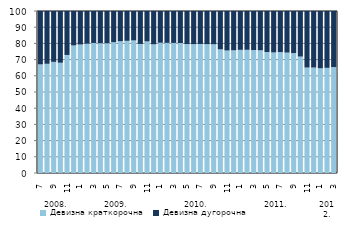
| Category | Девизна краткорочна | Девизна дугорочна |
|---|---|---|
| 0 | 67.053 | 32.947 |
| 1900-01-01 | 67.417 | 32.583 |
| 1900-01-02 | 68.6 | 31.4 |
| 1900-01-03 | 68.064 | 31.936 |
| 1900-01-04 | 72.867 | 27.133 |
| 1900-01-05 | 78.746 | 21.254 |
| 1900-01-06 | 79.327 | 20.673 |
| 1900-01-07 | 79.874 | 20.126 |
| 1900-01-08 | 80.278 | 19.722 |
| 1900-01-09 | 80.169 | 19.831 |
| 1900-01-10 | 80.15 | 19.85 |
| 1900-01-11 | 80.79 | 19.21 |
| 1900-01-12 | 81.336 | 18.664 |
| 1900-01-13 | 81.604 | 18.396 |
| 1900-01-14 | 81.871 | 18.129 |
| 1900-01-15 | 79.703 | 20.297 |
| 1900-01-16 | 81.223 | 18.777 |
| 1900-01-17 | 79.45 | 20.55 |
| 1900-01-18 | 80.414 | 19.586 |
| 1900-01-19 | 80.333 | 19.667 |
| 1900-01-20 | 80.293 | 19.707 |
| 1900-01-21 | 80.236 | 19.764 |
| 1900-01-22 | 79.606 | 20.394 |
| 1900-01-23 | 79.518 | 20.482 |
| 1900-01-24 | 79.653 | 20.347 |
| 1900-01-25 | 79.568 | 20.432 |
| 1900-01-26 | 79.468 | 20.532 |
| 1900-01-27 | 76.339 | 23.661 |
| 1900-01-28 | 75.64 | 24.36 |
| 1900-01-29 | 75.757 | 24.243 |
| 1900-01-30 | 76.031 | 23.969 |
| 1900-01-31 | 76.059 | 23.941 |
| 1900-02-01 | 75.901 | 24.099 |
| 1900-02-02 | 75.752 | 24.248 |
| 1900-02-03 | 74.695 | 25.305 |
| 1900-02-04 | 74.426 | 25.574 |
| 1900-02-05 | 74.633 | 25.367 |
| 1900-02-06 | 74.334 | 25.666 |
| 1900-02-07 | 74.02 | 25.98 |
| 1900-02-08 | 71.88 | 28.12 |
| 1900-02-09 | 65.118 | 34.882 |
| 1900-02-10 | 65.099 | 34.901 |
| 1900-02-11 | 64.67 | 35.33 |
| 1900-02-12 | 64.933 | 35.067 |
| 1900-02-13 | 65.378 | 34.622 |